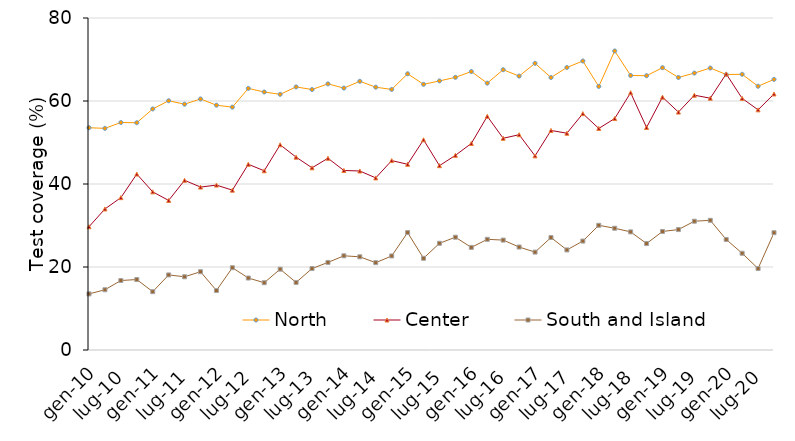
| Category | North | Center | South and Island |
|---|---|---|---|
| gen-10 | 53.557 | 29.71 | 13.519 |
| apr-10 | 53.409 | 33.983 | 14.518 |
| lug-10 | 54.815 | 36.71 | 16.743 |
| ott-10 | 54.77 | 42.397 | 16.98 |
| gen-11 | 58.087 | 38.11 | 14.049 |
| apr-11 | 60.059 | 36.043 | 18.088 |
| lug-11 | 59.235 | 40.89 | 17.643 |
| ott-11 | 60.49 | 39.257 | 18.86 |
| gen-12 | 58.987 | 39.74 | 14.339 |
| apr-12 | 58.519 | 38.513 | 19.828 |
| lug-12 | 63.035 | 44.75 | 17.343 |
| ott-12 | 62.17 | 43.187 | 16.21 |
| gen-13 | 61.607 | 49.45 | 19.479 |
| apr-13 | 63.389 | 46.473 | 16.278 |
| lug-13 | 62.765 | 43.9 | 19.633 |
| ott-13 | 64.13 | 46.207 | 21.1 |
| gen-14 | 63.117 | 43.26 | 22.699 |
| apr-14 | 64.749 | 43.133 | 22.458 |
| lug-14 | 63.325 | 41.47 | 21.043 |
| ott-14 | 62.79 | 45.647 | 22.66 |
| gen-15 | 66.557 | 44.75 | 28.299 |
| apr-15 | 64.019 | 50.653 | 22.098 |
| lug-15 | 64.835 | 44.42 | 25.713 |
| ott-15 | 65.7 | 46.907 | 27.18 |
| gen-16 | 67.097 | 49.77 | 24.719 |
| apr-16 | 64.299 | 56.313 | 26.668 |
| lug-16 | 67.535 | 51.02 | 26.483 |
| ott-16 | 66 | 51.877 | 24.81 |
| gen-17 | 69.077 | 46.78 | 23.589 |
| apr-17 | 65.659 | 52.903 | 27.098 |
| lug-17 | 68.075 | 52.24 | 24.113 |
| ott-17 | 69.64 | 56.957 | 26.25 |
| gen-18 | 63.507 | 53.39 | 30.049 |
| apr-18 | 72.059 | 55.773 | 29.338 |
| lug-18 | 66.155 | 62 | 28.463 |
| ott-18 | 66.09 | 53.617 | 25.65 |
| gen-19 | 68.027 | 60.93 | 28.559 |
| apr-19 | 65.669 | 57.323 | 29.018 |
| lug-19 | 66.725 | 61.4 | 31.033 |
| ott-19 | 67.95 | 60.677 | 31.25 |
| gen-20 | 66.387 | 66.53 | 26.629 |
| apr-20 | 66.429 | 60.633 | 23.308 |
| lug-20 | 63.555 | 57.87 | 19.633 |
| ott-20 | 65.21 | 61.697 | 28.26 |